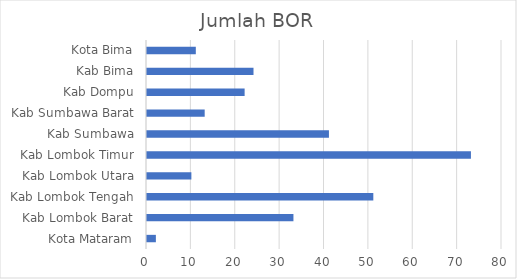
| Category | Jumlah BOR |
|---|---|
| Kota Mataram | 2 |
| Kab Lombok Barat | 33 |
| Kab Lombok Tengah | 51 |
| Kab Lombok Utara | 10 |
| Kab Lombok Timur | 73 |
| Kab Sumbawa | 41 |
| Kab Sumbawa Barat | 13 |
| Kab Dompu | 22 |
| Kab Bima | 24 |
| Kota Bima | 11 |